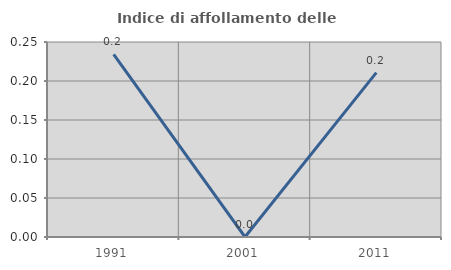
| Category | Indice di affollamento delle abitazioni  |
|---|---|
| 1991.0 | 0.234 |
| 2001.0 | 0 |
| 2011.0 | 0.211 |